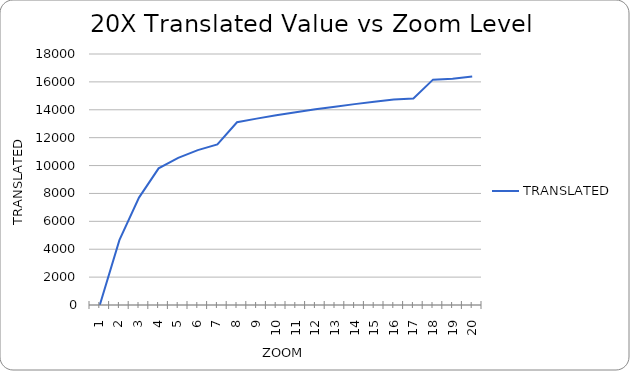
| Category | TRANSLATED |
|---|---|
| 1.0 | 0 |
| 2.0 | 4653.686 |
| 3.0 | 7702.055 |
| 4.0 | 9798.892 |
| 5.0 | 10548.775 |
| 6.0 | 11104.886 |
| 7.0 | 11520.788 |
| 8.0 | 13107.2 |
| 9.0 | 13365.563 |
| 10.0 | 13605.022 |
| 11.0 | 13827.151 |
| 12.0 | 14030.375 |
| 13.0 | 14222.572 |
| 14.0 | 14405.317 |
| 15.0 | 14572.308 |
| 16.0 | 14734.572 |
| 17.0 | 14808.615 |
| 18.0 | 16161.083 |
| 19.0 | 16233.551 |
| 20.0 | 16384 |